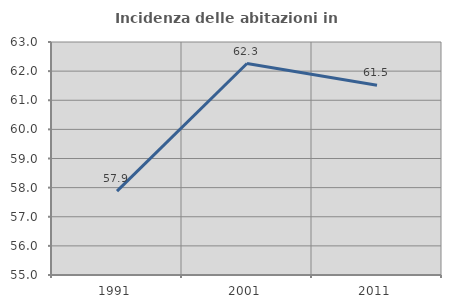
| Category | Incidenza delle abitazioni in proprietà  |
|---|---|
| 1991.0 | 57.88 |
| 2001.0 | 62.26 |
| 2011.0 | 61.514 |